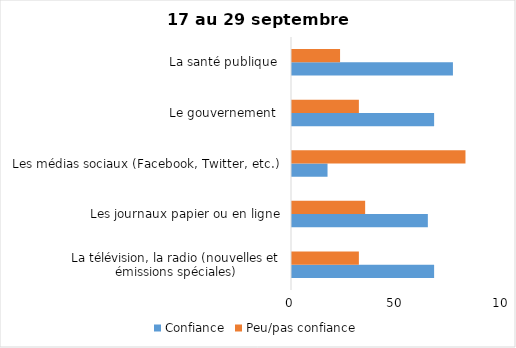
| Category | Confiance | Peu/pas confiance |
|---|---|---|
| La télévision, la radio (nouvelles et émissions spéciales) | 68 | 32 |
| Les journaux papier ou en ligne | 65 | 35 |
| Les médias sociaux (Facebook, Twitter, etc.) | 17 | 83 |
| Le gouvernement  | 68 | 32 |
| La santé publique  | 77 | 23 |